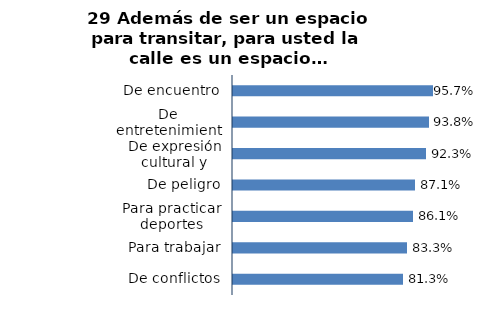
| Category | Series 0 |
|---|---|
| De encuentro | 0.957 |
| De entretenimiento | 0.938 |
| De expresión cultural y artística | 0.923 |
| De peligro | 0.871 |
| Para practicar deportes | 0.861 |
| Para trabajar | 0.833 |
| De conflictos | 0.813 |